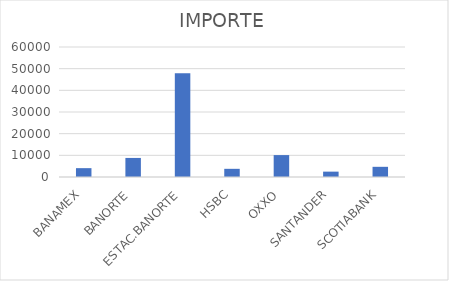
| Category | IMPORTE |
|---|---|
| BANAMEX | 4084.85 |
| BANORTE | 8797.51 |
| ESTAC.BANORTE | 47839.5 |
| HSBC | 3773.77 |
| OXXO | 10113.61 |
| SANTANDER | 2475.17 |
| SCOTIABANK | 4700.11 |